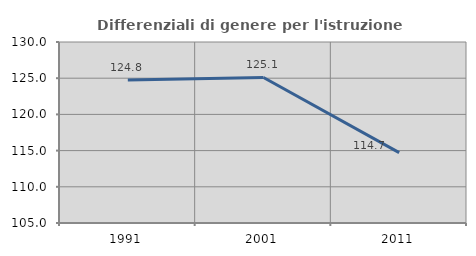
| Category | Differenziali di genere per l'istruzione superiore |
|---|---|
| 1991.0 | 124.753 |
| 2001.0 | 125.097 |
| 2011.0 | 114.718 |